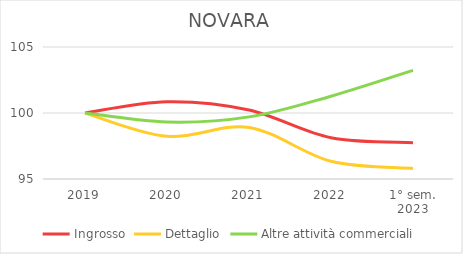
| Category | Ingrosso | Dettaglio | Altre attività commerciali |
|---|---|---|---|
| 2019 | 100 | 100 | 100 |
| 2020 | 100.848 | 98.23 | 99.314 |
| 2021 | 100.221 | 98.906 | 99.706 |
| 2022 | 98.119 | 96.34 | 101.273 |
| 1° sem.
2023 | 97.751 | 95.804 | 103.232 |